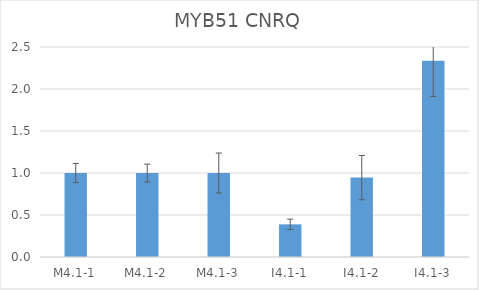
| Category | MYB51 CNRQ |
|---|---|
| M4.1-1 | 1 |
| M4.1-2 | 1 |
| M4.1-3 | 1 |
| I4.1-1 | 0.389 |
| I4.1-2 | 0.945 |
| I4.1-3 | 2.338 |